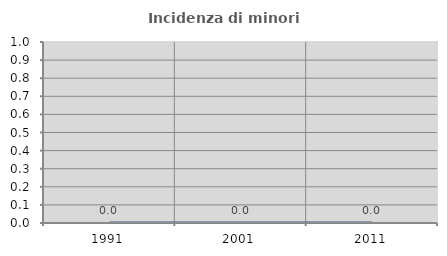
| Category | Incidenza di minori stranieri |
|---|---|
| 1991.0 | 0 |
| 2001.0 | 0 |
| 2011.0 | 0 |